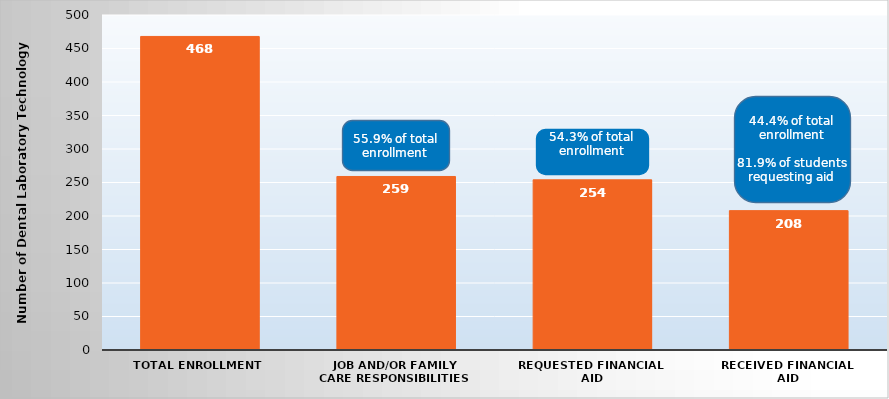
| Category | Series 0 |
|---|---|
| Total Enrollment | 468 |
| Job and/or Family Care Responsibilities | 259 |
| Requested Financial Aid | 254 |
| Received Financial Aid | 208 |